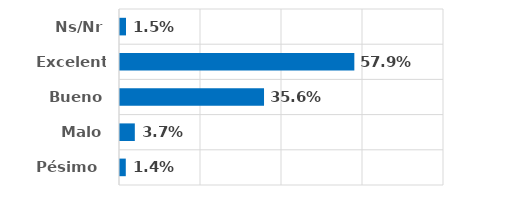
| Category | Series 0 |
|---|---|
| Pésimo  | 0.014 |
| Malo | 0.037 |
| Bueno | 0.356 |
| Excelente | 0.579 |
| Ns/Nr | 0.015 |